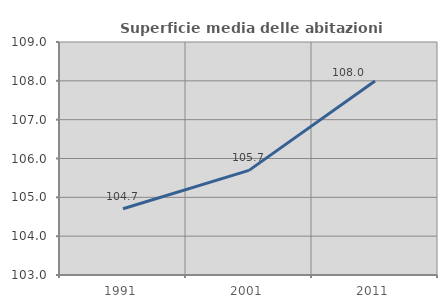
| Category | Superficie media delle abitazioni occupate |
|---|---|
| 1991.0 | 104.706 |
| 2001.0 | 105.695 |
| 2011.0 | 107.997 |